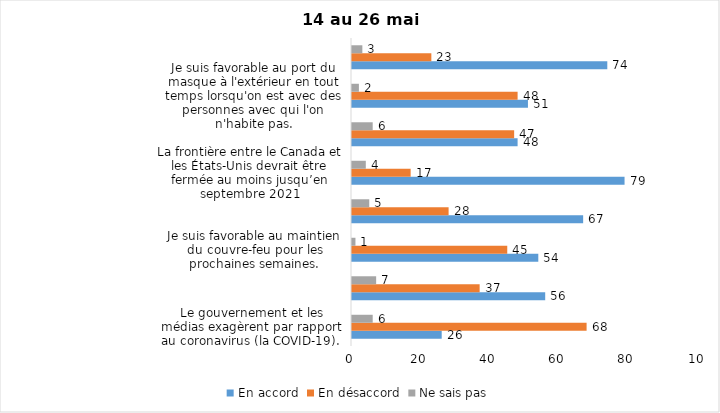
| Category | En accord | En désaccord | Ne sais pas |
|---|---|---|---|
| Le gouvernement et les médias exagèrent par rapport au coronavirus (la COVID-19). | 26 | 68 | 6 |
| J’ai peur que le système de santé soit débordé par les cas de COVID-19 suite au "déconfinement" | 56 | 37 | 7 |
| Je suis favorable au maintien du couvre-feu pour les prochaines semaines. | 54 | 45 | 1 |
| Je suis inquiet/inquiète  que le nombre de cas augmente en raison des nouveaux variants du virus de la COVID-19 | 67 | 28 | 5 |
| La frontière entre le Canada et les États-Unis devrait être fermée au moins jusqu’en septembre 2021 | 79 | 17 | 4 |
| Les personnes vaccinées contre la COVID-19 devraient avoir le droit de faire des rassemblements privés et de ne plus porter le masque dans les lieux publics. | 48 | 47 | 6 |
| Je suis favorable au port du masque à l'extérieur en tout temps lorsqu'on est avec des personnes avec qui l'on n'habite pas. | 51 | 48 | 2 |
| Je suis favorable au passeport vaccinal qui permettrait l'accès à certains lieux ou activités aux personnes vaccinées. | 74 | 23 | 3 |